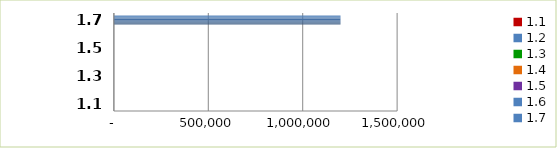
| Category | Series 0 |
|---|---|
| 1.1 | 0 |
| 1.2 | 0 |
| 1.3 | 0 |
| 1.4 | 0 |
| 1.5 | 0 |
| 1.6 | 0 |
| 1.7 | 1200000 |